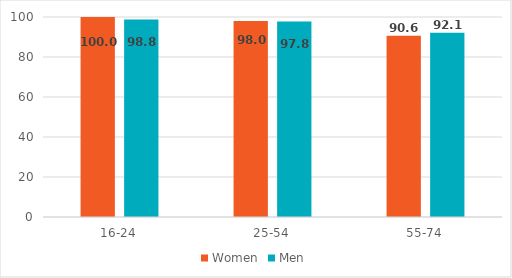
| Category | Women | Men |
|---|---|---|
| 16-24 | 100 | 98.8 |
| 25-54 | 98 | 97.8 |
| 55-74 | 90.6 | 92.1 |